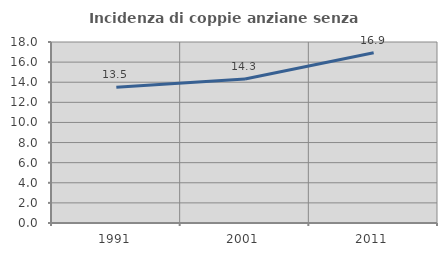
| Category | Incidenza di coppie anziane senza figli  |
|---|---|
| 1991.0 | 13.51 |
| 2001.0 | 14.32 |
| 2011.0 | 16.939 |